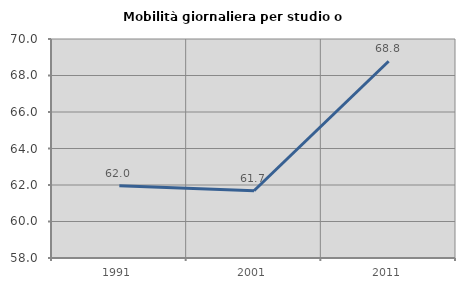
| Category | Mobilità giornaliera per studio o lavoro |
|---|---|
| 1991.0 | 61.952 |
| 2001.0 | 61.687 |
| 2011.0 | 68.781 |